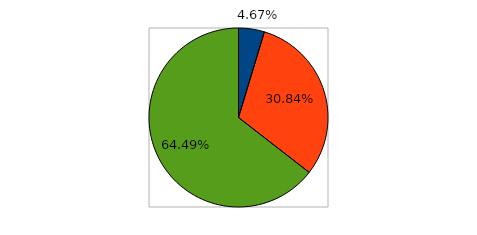
| Category | Series 0 |
|---|---|
| 0 | 0.047 |
| 1 | 0.308 |
| 2 | 0.645 |